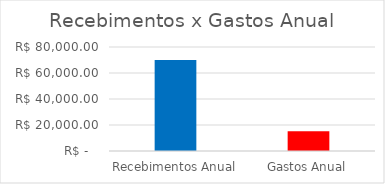
| Category | Series 0 | Series 1 | Series 2 | Series 3 | Series 4 | Series 5 | Series 6 | Series 7 | Series 8 | Series 9 | Series 10 | Series 11 | Series 12 | Series 13 | Series 14 | Series 15 | Series 16 | Series 17 | Series 18 | Series 19 | Series 20 | Series 21 | Series 22 | Series 23 | Series 24 | Series 25 | Series 26 | Series 27 | Series 28 | Series 29 | Series 30 | Series 31 | Series 32 | Series 33 | Series 34 | Series 35 |
|---|---|---|---|---|---|---|---|---|---|---|---|---|---|---|---|---|---|---|---|---|---|---|---|---|---|---|---|---|---|---|---|---|---|---|---|---|
| Recebimentos Anual |  |  |  |  |  |  |  |  |  |  |  |  |  |  |  |  |  |  |  |  |  |  |  |  |  |  |  |  |  |  |  |  |  |  |  | 70000 |
| Gastos Anual |  |  |  |  |  |  |  |  |  |  |  |  |  |  |  |  |  |  |  |  |  |  |  |  |  |  |  |  |  |  |  |  |  |  |  | 15191.8 |